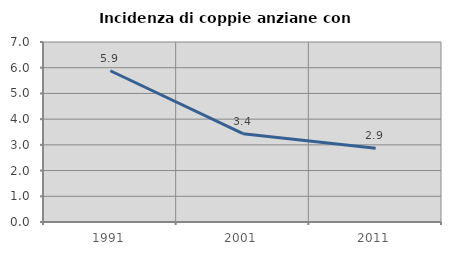
| Category | Incidenza di coppie anziane con figli |
|---|---|
| 1991.0 | 5.882 |
| 2001.0 | 3.435 |
| 2011.0 | 2.869 |